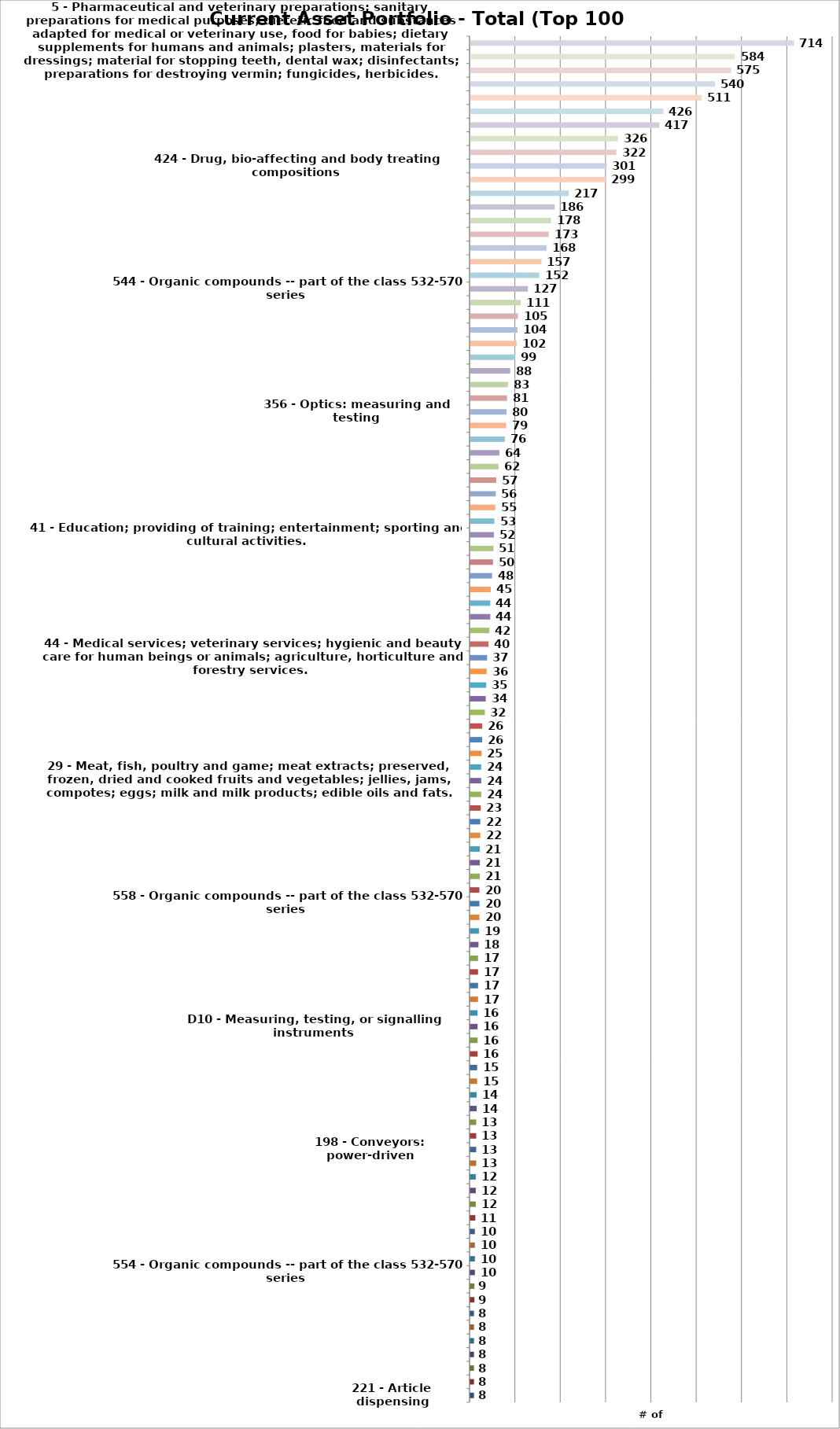
| Category | Series 0 |
|---|---|
| 221 - Article dispensing | 8 |
| 235 - Registers | 8 |
| 414 - Material or article handling | 8 |
| 439 - Electrical connectors | 8 |
| 568 - Organic compounds -- part of the class 532-570 series | 8 |
| 930 - Peptide or protein sequence | 8 |
| 31 - Grains and agricultural, horticultural and forestry products not included in other classes; live animals; fresh fruits and vegetables; seeds; natural plants and flowers; foodstuffs for animals; malt. | 8 |
| 324 - Electricity: measuring and testing | 9 |
| 714 - Error detection/correction and fault detection/recovery | 9 |
| 554 - Organic compounds -- part of the class 532-570 series | 10 |
| 709 - Electrical computers and digital processing systems: multicomputer data transferring | 10 |
| D03 - Travel goods and personal belongings | 10 |
| 32 - Beers; mineral and aerated waters and other non-alcoholic beverages; fruit beverages and fruit juices; syrups and other preparations for making beverages. | 10 |
| 455 - Telecommunications | 11 |
| 211 - Supports: racks | 12 |
| 372 - Coherent light generators | 12 |
| 30 - Coffee, tea, cocoa and artificial coffee; rice; tapioca and sago; flour and preparations made from cereals; bread, pastry and confectionery; ices; sugar, honey, treacle; yeast, baking-powder; salt; mustard; vinegar, sauces (condiments); spices; ice. | 12 |
| 118 - Coating apparatus | 13 |
| 198 - Conveyors: power-driven | 13 |
| 700 - Data processing: generic control systems or specific applications | 13 |
| 800 - Multicellular living organisms and unmodified parts thereof and related processes | 13 |
| 252 - Compositions | 14 |
| 552 - Organic compounds -- part of the class 532-570 series | 14 |
| 251 - Valves and valve actuation | 15 |
| 425 - Plastic article or earthenware shaping or treating: apparatus | 15 |
| 141 - Fluent material handling, with receiver or receiver coacting means | 16 |
| 705 - Data processing: financial, business practice, management, or cost/price determination | 16 |
| D10 - Measuring, testing, or signalling instruments | 16 |
| 2835 - In Vitro and In Vivo Diagnostic Substances | 16 |
| 53 - Package making | 17 |
| 148 - Metal treatment | 17 |
| 210 - Liquid purification or separation | 17 |
| 607 - Surgery: light, thermal, and electrical application | 17 |
| 137 - Fluid handling | 18 |
| Undisclosed | 19 |
| 428 - Stock material or miscellaneous articles | 20 |
| 558 - Organic compounds -- part of the class 532-570 series | 20 |
| 3841 - Surgical and Medical Instruments and Apparatus | 20 |
| 222 - Dispensing | 21 |
| 417 - Pumps | 21 |
| 524 - Synthetic resins or natural rubbers -- part of the class 520 series | 21 |
| 219 - Electric heating | 22 |
| 382 - Image analysis | 22 |
| 156 - Adhesive bonding and miscellaneous chemical manufacture | 23 |
| 510 - Cleaning compositions for solid surfaces, auxiliary compositions therefor, or processes of preparing the compositions | 24 |
| 29 - Meat, fish, poultry and game; meat extracts; preserved, frozen, dried and cooked fruits and vegetables; jellies, jams, compotes; eggs; milk and milk products; edible oils and fats. | 24 |
| 35 - Advertising; business management; business administration; office functions. | 24 |
| 134 - Cleaning and liquid contact with solids | 25 |
| 220 - Receptacles | 26 |
| 359 - Optical: systems and elements | 26 |
| 2836 - Biological Products, Except Diagnostic Substances | 32 |
| 526 - Synthetic resins or natural rubbers -- part of the class 520 series | 34 |
| 528 - Synthetic resins or natural rubbers -- part of the class 520 series | 35 |
| 215 - Bottles and jars | 36 |
| 44 - Medical services; veterinary services; hygienic and beauty care for human beings or animals; agriculture, horticulture and forestry services. | 37 |
| 523 - Synthetic resins or natural rubbers -- part of the class 520 series | 40 |
| 560 - Organic compounds -- part of the class 532-570 series | 42 |
| 29 - Metal working | 44 |
| 525 - Synthetic resins or natural rubbers -- part of the class 520 series | 44 |
| 42 - Scientific and technological services and research and design relating thereto; industrial analysis and research services; design and development of computer hardware and software. | 45 |
| 340 - Communications: electrical | 48 |
| 562 - Organic compounds -- part of the class 532-570 series | 50 |
| 206 - Special receptacle or package | 51 |
| 41 - Education; providing of training; entertainment; sporting and cultural activities. | 52 |
| 73 - Measuring and testing | 53 |
| 702 - Data processing: measuring, calibrating, or testing | 55 |
| 250 - Radiant energy | 56 |
| 564 - Organic compounds -- part of the class 532-570 series | 57 |
| 540 - Organic compounds -- part of the class 532-570 series | 62 |
| D09 - Packages and containers for goods | 64 |
| 427 - Coating processes | 76 |
| 549 - Organic compounds -- part of the class 532-570 series | 79 |
| 356 - Optics: measuring and testing | 80 |
| 128 - Surgery | 81 |
| 426 - Food or edible material: processes, compositions, and products | 83 |
| 2834 - Pharmaceutical Preparations | 88 |
| 264 - Plastic and nonmetallic article shaping or treating: processes | 99 |
| 9 - Scientific, nautical, surveying, photographic, cinematographic, optical, weighing, measuring, signalling, checking (supervision), life-saving and teaching apparatus and instruments; apparatus and instruments for conducting, switching, transforming, ac | 102 |
| 1 - Chemicals used in industry, science and photography, as well as in agriculture, horticulture and forestry; unprocessed artificial resins, unprocessed plastics; manures; fire extinguishing compositions; tempering and soldering preparations; chemical su | 104 |
| 205 - Electrolysis: processes, compositions used therein, and methods of preparing the compositions | 105 |
| 16 - Paper, cardboard and goods made from these materials, not included in other classes; printed matter; bookbinding material; photographs; stationery; adhesives for stationery or household purposes; artists' materials; paint brushes; typewriters and off | 111 |
| 544 - Organic compounds -- part of the class 532-570 series | 127 |
| 548 - Organic compounds -- part of the class 532-570 series | 152 |
| D24 - Medical and laboratory equipment | 157 |
| 204 - Chemistry: electrical and wave energy | 168 |
| 530 - Chemistry: natural resins or derivatives; peptides or proteins; lignins or reaction products thereof | 173 |
| 546 - Organic compounds -- part of the class 532-570 series | 178 |
| 351 - Optics: eye examining, vision testing and correcting | 186 |
| 536 - Organic compounds -- part of the class 532-570 series | 217 |
| 422 - Chemical apparatus and process disinfecting, deodorizing, preserving, or sterilizing | 299 |
| 424 - Drug, bio-affecting and body treating compositions | 301 |
| 436 - Chemistry: analytical and immunological testing | 322 |
| 600 - Surgery | 326 |
| 10 - Surgical, medical, dental and veterinary apparatus and instruments, artificial limbs, eyes and teeth; orthopaedic articles; suture materials. | 417 |
| 604 - Surgery | 426 |
| 435 - Chemistry: molecular biology and microbiology | 511 |
| 623 - Prosthesis (i.e., artificial body members), parts thereof, or aids and accessories therefor | 540 |
| 606 - Surgery | 575 |
| 514 - Drug, bio-affecting and body treating compositions | 584 |
| 5 - Pharmaceutical and veterinary preparations; sanitary preparations for medical purposes; dietetic food and substances adapted for medical or veterinary use, food for babies; dietary supplements for humans and animals; plasters, materials for dressings; | 714 |